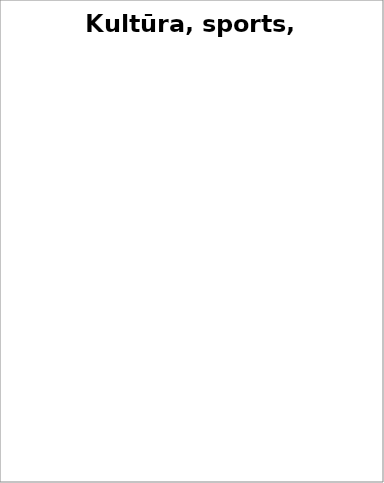
| Category | Kultūra, sports, atpūta |
|---|---|
|  Bibliotēkas  | 0.001 |
| Muzeji un izstādes | 0.073 |
| Kultūras procesu veicināšana, pieminekļu aizsardzība un arhīvi  | 0.131 |
| Teātri, izrādes, koncertdarbība | 0.132 |
| Sports | 0.196 |
| Biedrības un reliģiskās organizācijas | 0.233 |
| Filmu nozare | 0.3 |